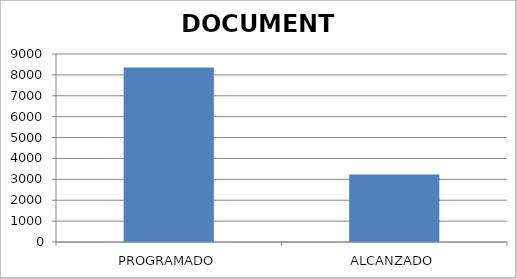
| Category | DOCUMENTO |
|---|---|
| PROGRAMADO | 8348 |
| ALCANZADO | 3230 |